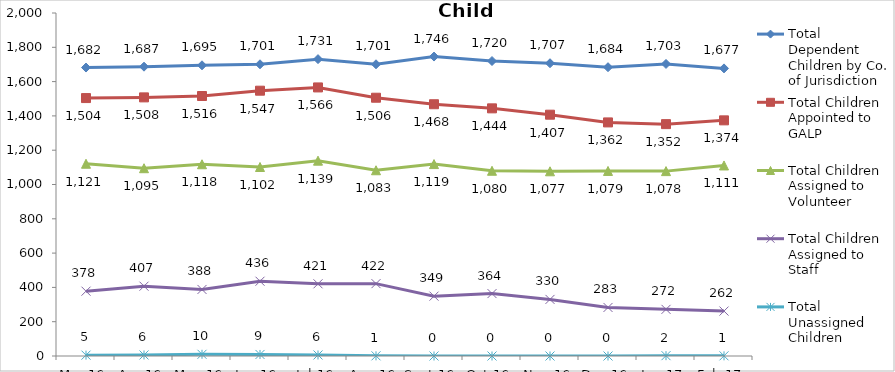
| Category | Total Dependent Children by Co. of Jurisdiction | Total Children Appointed to GALP | Total Children Assigned to Volunteer | Total Children Assigned to Staff | Total Unassigned Children |
|---|---|---|---|---|---|
| Mar-16 | 1682 | 1504 | 1121 | 378 | 5 |
| Apr-16 | 1687 | 1508 | 1095 | 407 | 6 |
| May-16 | 1695 | 1516 | 1118 | 388 | 10 |
| Jun-16 | 1701 | 1547 | 1102 | 436 | 9 |
| Jul-16 | 1731 | 1566 | 1139 | 421 | 6 |
| Aug-16 | 1701 | 1506 | 1083 | 422 | 1 |
| Sep-16 | 1746 | 1468 | 1119 | 349 | 0 |
| Oct-16 | 1720 | 1444 | 1080 | 364 | 0 |
| Nov-16 | 1707 | 1407 | 1077 | 330 | 0 |
| Dec-16 | 1684 | 1362 | 1079 | 283 | 0 |
| Jan-17 | 1703 | 1352 | 1078 | 272 | 2 |
| Feb-17 | 1677 | 1374 | 1111 | 262 | 1 |